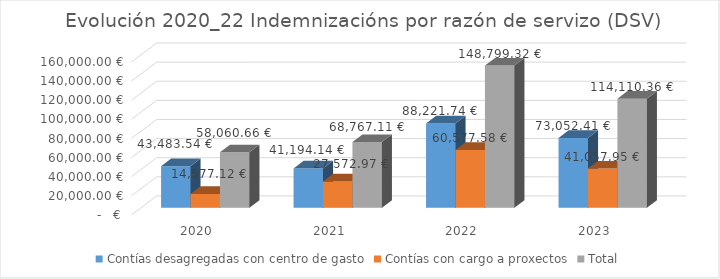
| Category | Contías desagregadas con centro de gasto | Contías con cargo a proxectos | Total |
|---|---|---|---|
| 2020.0 | 43483.54 | 14577.12 | 58060.66 |
| 2021.0 | 41194.14 | 27572.97 | 68767.11 |
| 2022.0 | 88221.74 | 60577.58 | 148799.32 |
| 2023.0 | 73052.41 | 41057.95 | 114110.36 |